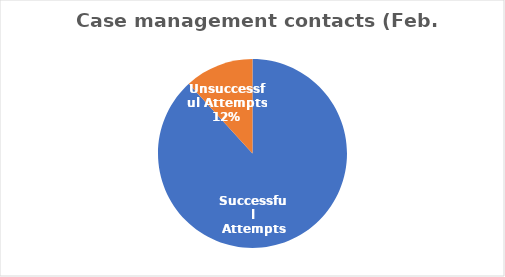
| Category | Series 0 |
|---|---|
| Successful Attempts | 390 |
| Unsuccessful Attempts | 52 |